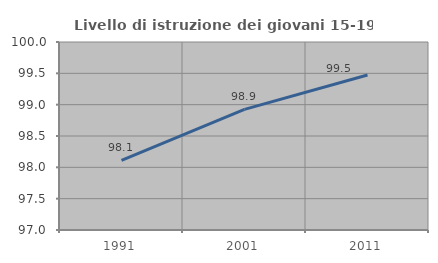
| Category | Livello di istruzione dei giovani 15-19 anni |
|---|---|
| 1991.0 | 98.11 |
| 2001.0 | 98.925 |
| 2011.0 | 99.472 |